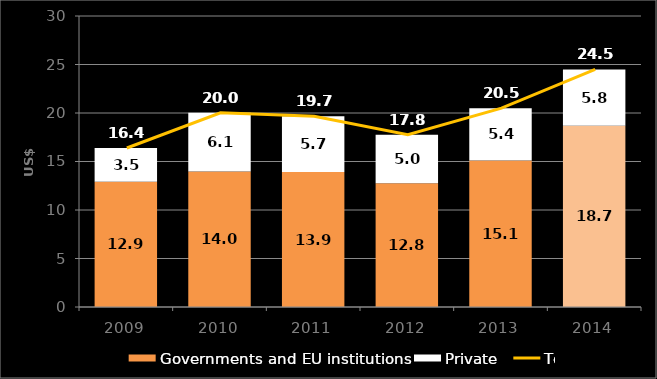
| Category | Governments and EU institutions | Private  |
|---|---|---|
| 2009.0 | 12.924 | 3.467 |
| 2010.0 | 13.962 | 6.059 |
| 2011.0 | 13.917 | 5.738 |
| 2012.0 | 12.758 | 4.998 |
| 2013.0 | 15.104 | 5.398 |
| 2014.0 | 18.68 | 5.81 |